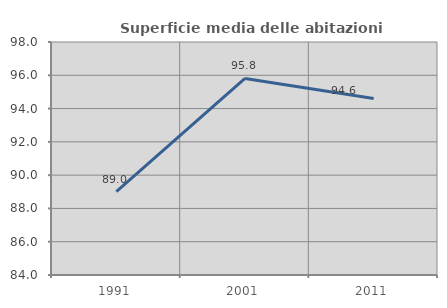
| Category | Superficie media delle abitazioni occupate |
|---|---|
| 1991.0 | 89.006 |
| 2001.0 | 95.81 |
| 2011.0 | 94.606 |